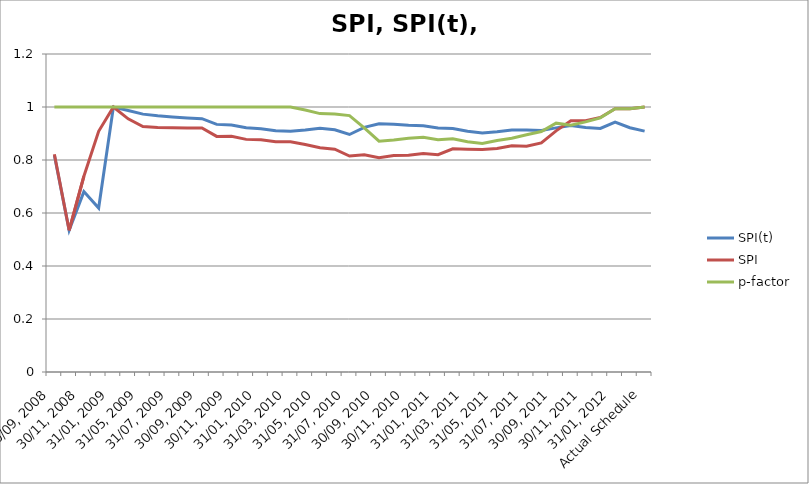
| Category | SPI(t) | SPI | p-factor |
|---|---|---|---|
| 30/09, 2008 | 0.818 | 0.822 | 1 |
| 31/10, 2008 | 0.535 | 0.535 | 1 |
| 30/11, 2008 | 0.681 | 0.739 | 1 |
| 31/12, 2008 | 0.619 | 0.908 | 1 |
| 31/01, 2009 | 1 | 1 | 1 |
| 30/04, 2009 | 0.987 | 0.955 | 1 |
| 31/05, 2009 | 0.973 | 0.926 | 1 |
| 30/06, 2009 | 0.967 | 0.923 | 1 |
| 31/07, 2009 | 0.962 | 0.922 | 1 |
| 31/08, 2009 | 0.959 | 0.921 | 1 |
| 30/09, 2009 | 0.956 | 0.921 | 1 |
| 31/10, 2009 | 0.934 | 0.889 | 1 |
| 30/11, 2009 | 0.932 | 0.889 | 1 |
| 31/12, 2009 | 0.922 | 0.878 | 1 |
| 31/01, 2010 | 0.918 | 0.877 | 1 |
| 28/02, 2010 | 0.911 | 0.869 | 1 |
| 31/03, 2010 | 0.908 | 0.868 | 1 |
| 30/04, 2010 | 0.913 | 0.859 | 0.988 |
| 31/05, 2010 | 0.92 | 0.846 | 0.975 |
| 30/06, 2010 | 0.914 | 0.841 | 0.974 |
| 31/07, 2010 | 0.896 | 0.815 | 0.968 |
| 31/08, 2010 | 0.923 | 0.82 | 0.921 |
| 30/09, 2010 | 0.937 | 0.809 | 0.871 |
| 31/10, 2010 | 0.935 | 0.817 | 0.876 |
| 30/11, 2010 | 0.931 | 0.818 | 0.882 |
| 31/12, 2010 | 0.929 | 0.825 | 0.885 |
| 31/01, 2011 | 0.921 | 0.82 | 0.877 |
| 28/02, 2011 | 0.919 | 0.842 | 0.88 |
| 31/03, 2011 | 0.908 | 0.841 | 0.869 |
| 30/04, 2011 | 0.902 | 0.84 | 0.862 |
| 31/05, 2011 | 0.907 | 0.843 | 0.874 |
| 30/06, 2011 | 0.914 | 0.854 | 0.882 |
| 31/07, 2011 | 0.913 | 0.852 | 0.895 |
| 31/08, 2011 | 0.911 | 0.865 | 0.907 |
| 30/09, 2011 | 0.921 | 0.91 | 0.939 |
| 31/10, 2011 | 0.93 | 0.948 | 0.931 |
| 30/11, 2011 | 0.922 | 0.948 | 0.944 |
| 31/12, 2011 | 0.919 | 0.961 | 0.959 |
| 31/01, 2012 | 0.943 | 0.993 | 0.993 |
| 29/02, 2012 | 0.922 | 0.993 | 0.993 |
| Actual Schedule | 0.909 | 1 | 1 |